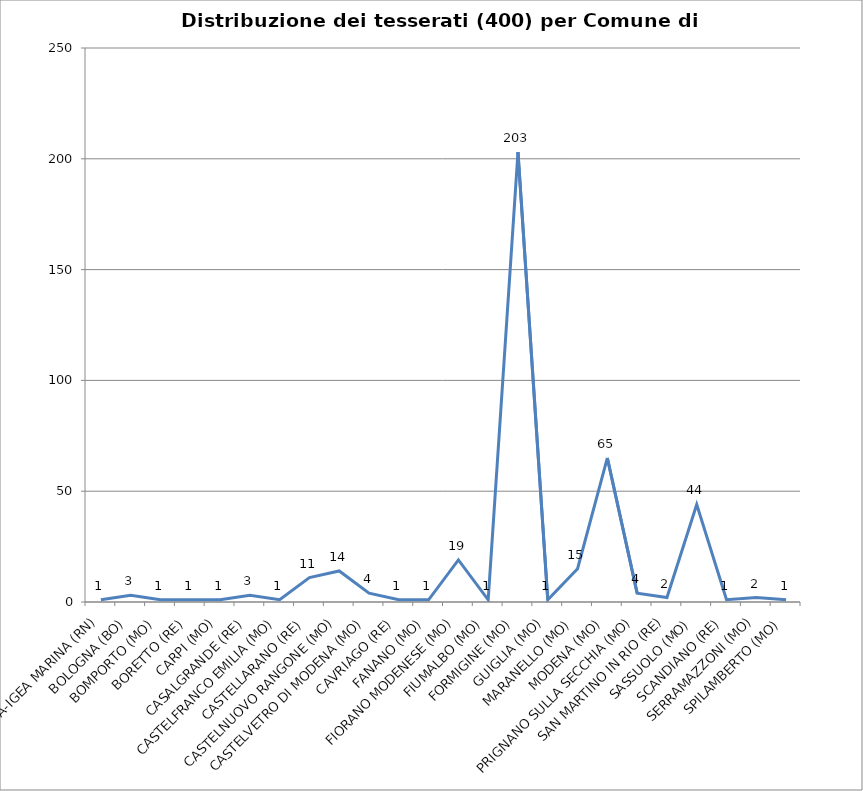
| Category | Nr. Tesserati |
|---|---|
| BELLARIA-IGEA MARINA (RN) | 1 |
| BOLOGNA (BO) | 3 |
| BOMPORTO (MO) | 1 |
| BORETTO (RE) | 1 |
| CARPI (MO) | 1 |
| CASALGRANDE (RE) | 3 |
| CASTELFRANCO EMILIA (MO) | 1 |
| CASTELLARANO (RE) | 11 |
| CASTELNUOVO RANGONE (MO) | 14 |
| CASTELVETRO DI MODENA (MO) | 4 |
| CAVRIAGO (RE) | 1 |
| FANANO (MO) | 1 |
| FIORANO MODENESE (MO) | 19 |
| FIUMALBO (MO) | 1 |
| FORMIGINE (MO) | 203 |
| GUIGLIA (MO) | 1 |
| MARANELLO (MO) | 15 |
| MODENA (MO) | 65 |
| PRIGNANO SULLA SECCHIA (MO) | 4 |
| SAN MARTINO IN RIO (RE) | 2 |
| SASSUOLO (MO) | 44 |
| SCANDIANO (RE) | 1 |
| SERRAMAZZONI (MO) | 2 |
| SPILAMBERTO (MO) | 1 |